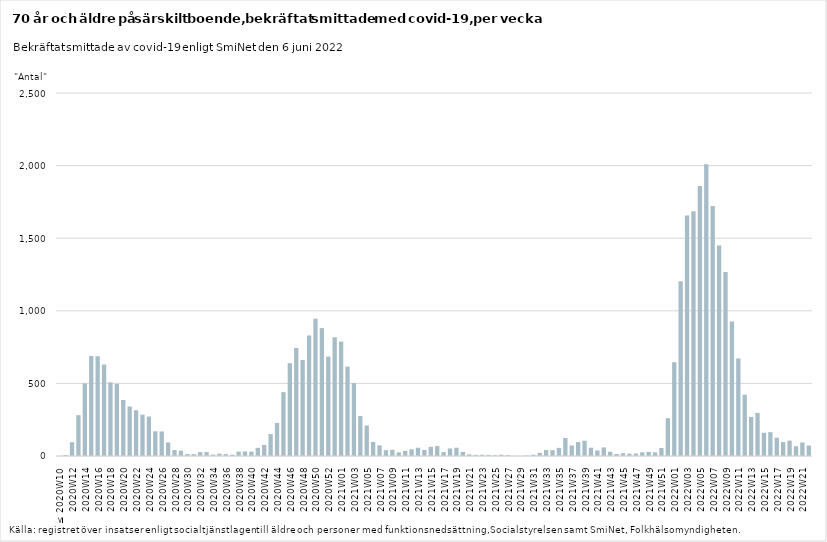
| Category | Series 0 |
|---|---|
| ≤ 2020W10 | 0 |
| 2020W11 | 7 |
| 2020W12 | 95 |
| 2020W13 | 281 |
| 2020W14 | 500 |
| 2020W15 | 689 |
| 2020W16 | 687 |
| 2020W17 | 630 |
| 2020W18 | 507 |
| 2020W19 | 497 |
| 2020W20 | 386 |
| 2020W21 | 341 |
| 2020W22 | 315 |
| 2020W23 | 285 |
| 2020W24 | 272 |
| 2020W25 | 170 |
| 2020W26 | 169 |
| 2020W27 | 93 |
| 2020W28 | 41 |
| 2020W29 | 37 |
| 2020W30 | 13 |
| 2020W31 | 13 |
| 2020W32 | 27 |
| 2020W33 | 27 |
| 2020W34 | 10 |
| 2020W35 | 16 |
| 2020W36 | 13 |
| 2020W37 | 9 |
| 2020W38 | 30 |
| 2020W39 | 31 |
| 2020W40 | 30 |
| 2020W41 | 56 |
| 2020W42 | 76 |
| 2020W43 | 151 |
| 2020W44 | 228 |
| 2020W45 | 440 |
| 2020W46 | 639 |
| 2020W47 | 744 |
| 2020W48 | 661 |
| 2020W49 | 830 |
| 2020W50 | 946 |
| 2020W51 | 881 |
| 2020W52 | 685 |
| 2020W53 | 818 |
| 2021W01 | 788 |
| 2021W02 | 616 |
| 2021W03 | 502 |
| 2021W04 | 275 |
| 2021W05 | 210 |
| 2021W06 | 97 |
| 2021W07 | 73 |
| 2021W08 | 40 |
| 2021W09 | 43 |
| 2021W10 | 25 |
| 2021W11 | 35 |
| 2021W12 | 46 |
| 2021W13 | 57 |
| 2021W14 | 42 |
| 2021W15 | 63 |
| 2021W16 | 68 |
| 2021W17 | 27 |
| 2021W18 | 52 |
| 2021W19 | 57 |
| 2021W20 | 28 |
| 2021W21 | 11 |
| 2021W22 | 8 |
| 2021W23 | 9 |
| 2021W24 | 8 |
| 2021W25 | 6 |
| 2021W26 | 9 |
| 2021W27 | 6 |
| 2021W28 | 0 |
| 2021W29 | 0 |
| 2021W30 | 4 |
| 2021W31 | 9 |
| 2021W32 | 22 |
| 2021W33 | 41 |
| 2021W34 | 40 |
| 2021W35 | 56 |
| 2021W36 | 124 |
| 2021W37 | 72 |
| 2021W38 | 96 |
| 2021W39 | 105 |
| 2021W40 | 57 |
| 2021W41 | 38 |
| 2021W42 | 59 |
| 2021W43 | 29 |
| 2021W44 | 14 |
| 2021W45 | 19 |
| 2021W46 | 16 |
| 2021W47 | 17 |
| 2021W48 | 25 |
| 2021W49 | 28 |
| 2021W50 | 25 |
| 2021W51 | 55 |
| 2021W52 | 260 |
| 2022W01 | 646 |
| 2022W02 | 1204 |
| 2022W03 | 1657 |
| 2022W04 | 1685 |
| 2022W05 | 1859 |
| 2022W06 | 2009 |
| 2022W07 | 1721 |
| 2022W08 | 1450 |
| 2022W09 | 1267 |
| 2022W10 | 927 |
| 2022W11 | 672 |
| 2022W12 | 422 |
| 2022W13 | 269 |
| 2022W14 | 297 |
| 2022W15 | 160 |
| 2022W16 | 164 |
| 2022W17 | 126 |
| 2022W18 | 96 |
| 2022W19 | 106 |
| 2022W20 | 67 |
| 2022W21 | 93 |
| 2022W22 | 72 |